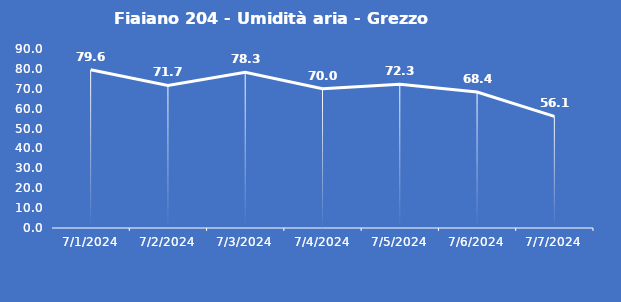
| Category | Fiaiano 204 - Umidità aria - Grezzo (%) |
|---|---|
| 7/1/24 | 79.6 |
| 7/2/24 | 71.7 |
| 7/3/24 | 78.3 |
| 7/4/24 | 70 |
| 7/5/24 | 72.3 |
| 7/6/24 | 68.4 |
| 7/7/24 | 56.1 |